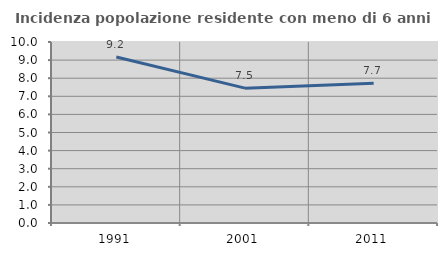
| Category | Incidenza popolazione residente con meno di 6 anni |
|---|---|
| 1991.0 | 9.175 |
| 2001.0 | 7.45 |
| 2011.0 | 7.721 |